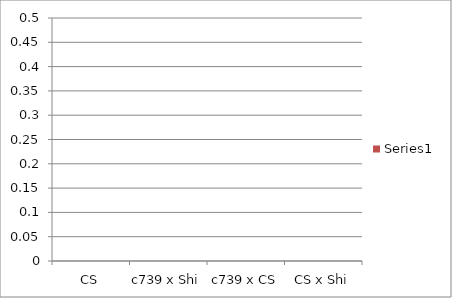
| Category | Series 0 |
|---|---|
| CS | 0 |
| c739 x Shi | 0 |
| c739 x CS | 0 |
| CS x Shi | 0 |